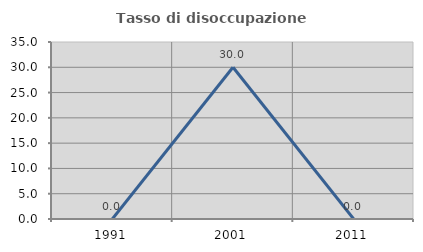
| Category | Tasso di disoccupazione giovanile  |
|---|---|
| 1991.0 | 0 |
| 2001.0 | 30 |
| 2011.0 | 0 |